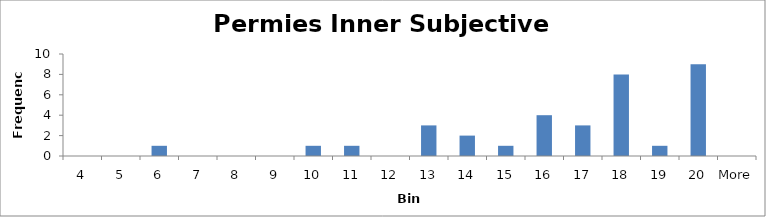
| Category | Frequency |
|---|---|
| 4 | 0 |
| 5 | 0 |
| 6 | 1 |
| 7 | 0 |
| 8 | 0 |
| 9 | 0 |
| 10 | 1 |
| 11 | 1 |
| 12 | 0 |
| 13 | 3 |
| 14 | 2 |
| 15 | 1 |
| 16 | 4 |
| 17 | 3 |
| 18 | 8 |
| 19 | 1 |
| 20 | 9 |
| More | 0 |